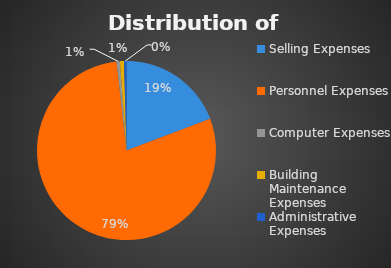
| Category | Revenue | Costs |
|---|---|---|
| Jan 18 | 1520700.44 | 831653.14 |
| Feb 18 | 1362633.87 | 751315.14 |
| Mar 18 | 1342353.4 | 738515.66 |
| Apr 18 | 1486887.18 | 828424.95 |
| May 18 | 1499552.72 | 823219.4 |
| Jun 18 | 1725549.15 | 949760.41 |
| Jul 18 | 1753199.59 | 979979.98 |
| Aug 18 | 1588508.17 | 896801.79 |
| Sep 18 | 1588964.29 | 889217.51 |
| Oct 18 | 1912375.35 | 1079848.55 |
| Nov 18 | 2013192.18 | 1141288.54 |
| Dec 18 | 1928083.14 | 1063088.72 |